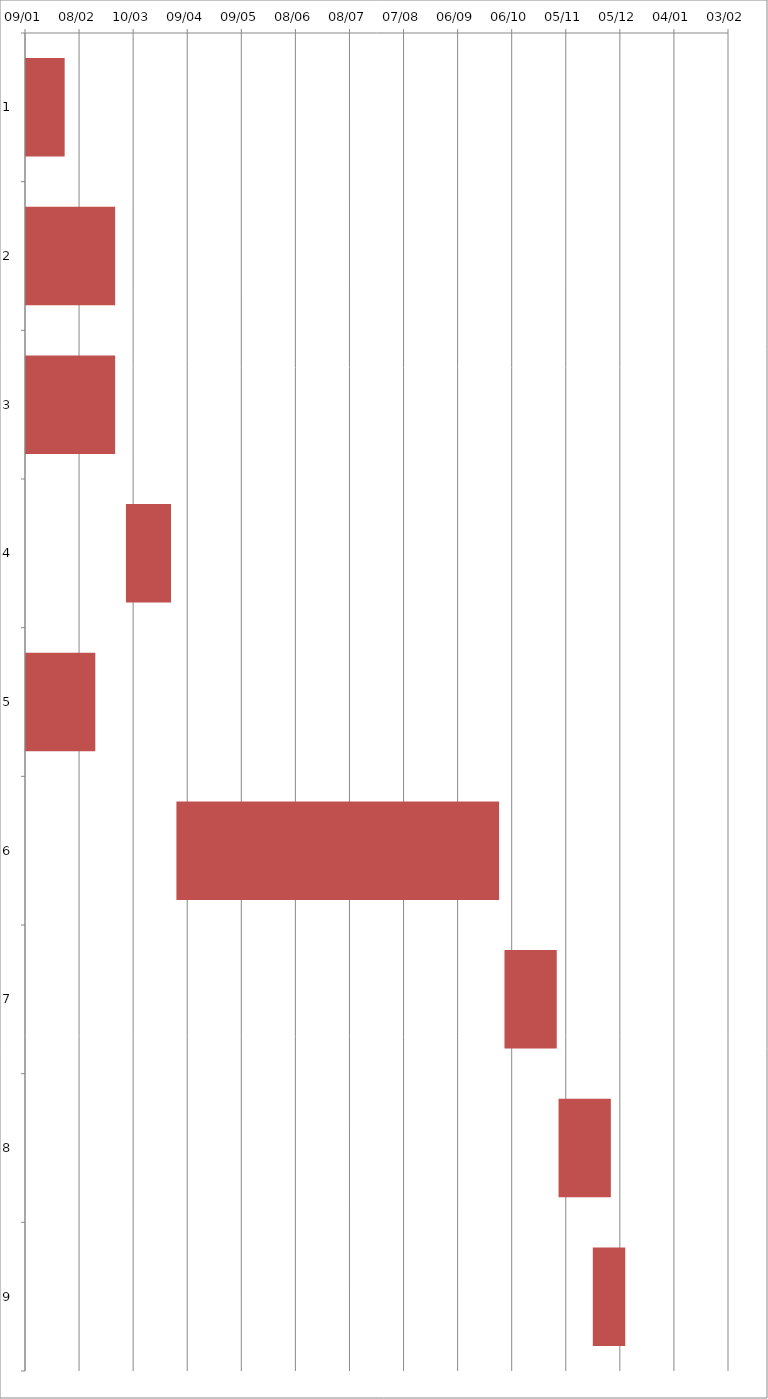
| Category | Fecha de inicio | DURACIÓN |
|---|---|---|
| 0 | 1/9/17 | 22 |
| 1 | 1/9/17 | 50 |
| 2 | 1/9/17 | 50 |
| 3 | 3/6/17 | 25 |
| 4 | 1/9/17 | 39 |
| 5 | 4/3/17 | 179 |
| 6 | 10/2/17 | 29 |
| 7 | 11/1/17 | 29 |
| 8 | 11/20/17 | 18 |